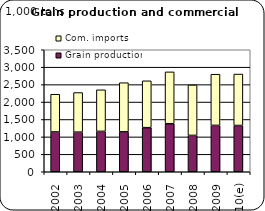
| Category | Grain production | Com. imports |
|---|---|---|
| 2002 | 1141.558 | 1082.433 |
| 2003 | 1135.844 | 1137.045 |
| 2004 | 1158.519 | 1192.576 |
| 2005 | 1145.281 | 1409.73 |
| 2006 | 1264.686 | 1344.566 |
| 2007 | 1378.239 | 1487.334 |
| 2008 | 1042.81 | 1447.722 |
| 2009 | 1330.328 | 1467.86 |
| 2010(e) | 1327.48 | 1475.762 |